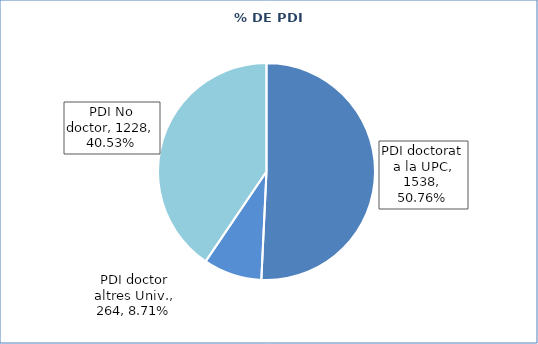
| Category | Series 0 |
|---|---|
| PDI doctorat a la UPC | 1538 |
| PDI doctor altres Univ. | 264 |
| PDI No doctor | 1228 |